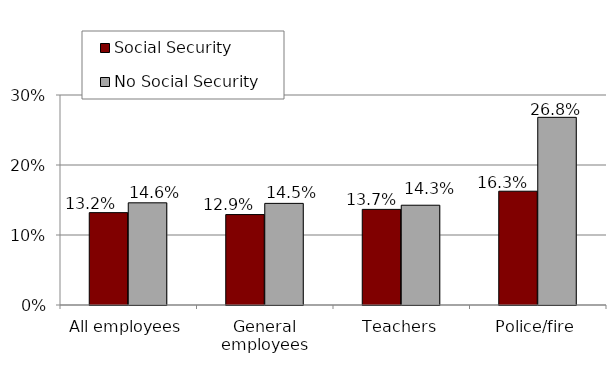
| Category | Social Security | No Social Security |
|---|---|---|
| All employees | 0.132 | 0.146 |
| General employees | 0.129 | 0.145 |
| Teachers | 0.137 | 0.143 |
| Police/fire | 0.163 | 0.268 |